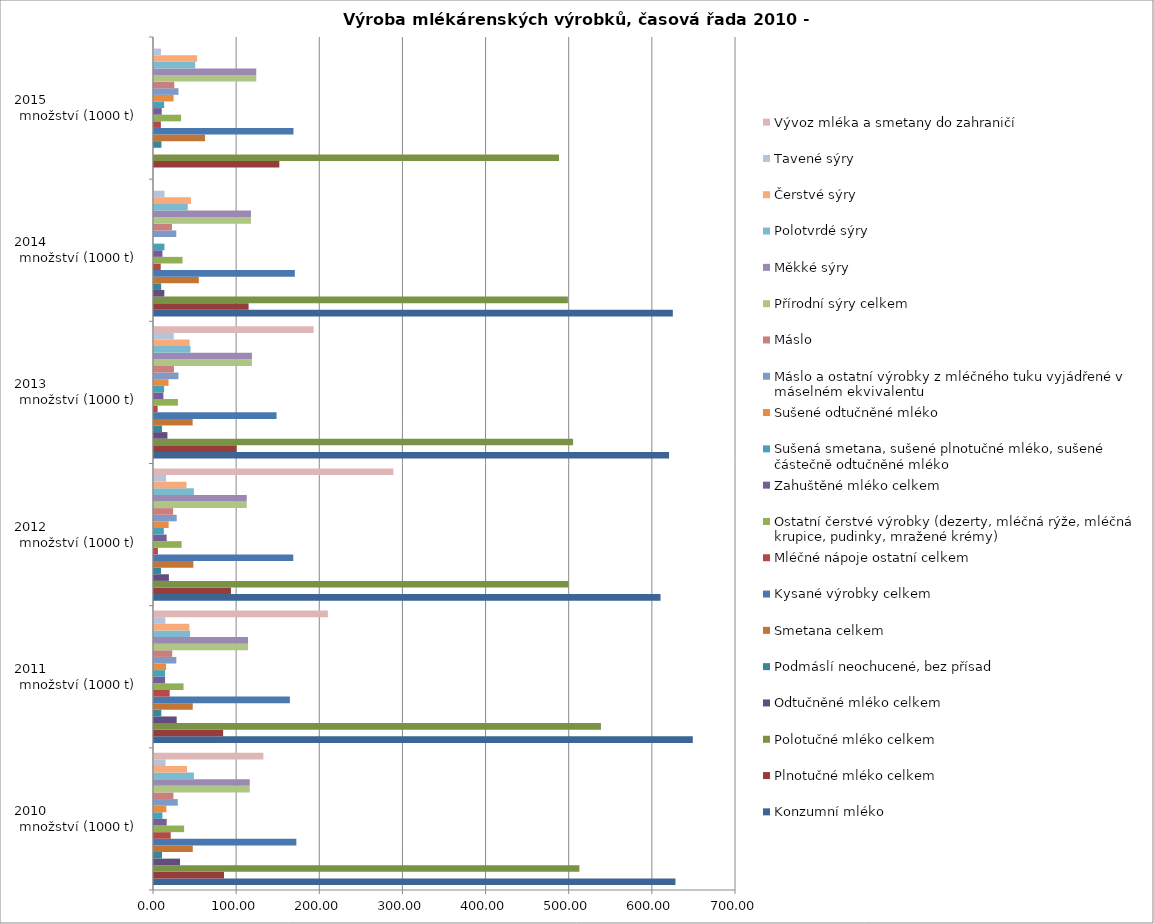
| Category | Konzumní mléko | Plnotučné mléko celkem | Polotučné mléko celkem | Odtučněné mléko celkem | Podmáslí neochucené, bez přísad | Smetana celkem | Kysané výrobky celkem | Mléčné nápoje ostatní celkem | Ostatní čerstvé výrobky (dezerty, mléčná rýže, mléčná krupice, pudinky, mražené krémy) | Zahuštěné mléko celkem | Sušená smetana, sušené plnotučné mléko, sušené částečně odtučněné mléko | Sušené odtučněné mléko | Máslo a ostatní výrobky z mléčného tuku vyjádřené v máselném ekvivalentu | Máslo | Přírodní sýry celkem | Měkké sýry | Polotvrdé sýry | Čerstvé sýry | Tavené sýry | Vývoz mléka a smetany do zahraničí |
|---|---|---|---|---|---|---|---|---|---|---|---|---|---|---|---|---|---|---|---|---|
| 2010                       množství (1000 t) | 627.18 | 84.22 | 511.65 | 31.31 | 9.59 | 46.62 | 171.22 | 20.13 | 36.24 | 15.3 | 10.16 | 14.83 | 28.58 | 23.38 | 115.16 | 115.16 | 47.97 | 39.7 | 13.95 | 131.59 |
| 2011                       množství (1000 t) | 648.01 | 83.17 | 537.55 | 27.29 | 8.79 | 46.62 | 163.41 | 18.87 | 35.54 | 13.31 | 13.29 | 14.54 | 26.86 | 21.89 | 113.12 | 113.12 | 43.36 | 42.51 | 13.62 | 209.08 |
| 2012                       množství (1000 t) | 609.23 | 92.58 | 498.716 | 17.934 | 8.47 | 47.348 | 167.509 | 4.704 | 33.235 | 15.214 | 11.801 | 17.623 | 27.304 | 23.02 | 111.547 | 111.547 | 48.011 | 39.071 | 14.567 | 287.857 |
| 2013                       množství (1000 t) | 619.496 | 99.29 | 504.066 | 16.14 | 9.599 | 46.497 | 147.41 | 4.388 | 28.818 | 11.26 | 12.18 | 17.469 | 29.49 | 23.983 | 117.79 | 117.79 | 43.859 | 42.885 | 23.79 | 191.98 |
| 2014                       množství (1000 t) | 624.03 | 113.793 | 497.797 | 12.44 | 8.625 | 53.93 | 169.37 | 8.137 | 34.317 | 10.19 | 12.54 | 0 | 26.8 | 21.68 | 116.64 | 116.64 | 40.596 | 44.46 | 12.652 | 0 |
| 2015                       množství (1000 t) | 0 | 150.765 | 487.11 | 0 | 8.965 | 61.426 | 167.754 | 8.26 | 32.576 | 9.299 | 12.205 | 23.564 | 29.434 | 24.416 | 123.008 | 123.008 | 49.513 | 51.87 | 8.376 | 0 |